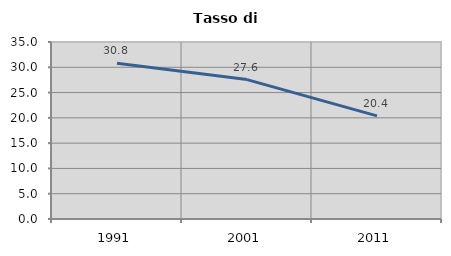
| Category | Tasso di disoccupazione   |
|---|---|
| 1991.0 | 30.793 |
| 2001.0 | 27.567 |
| 2011.0 | 20.39 |